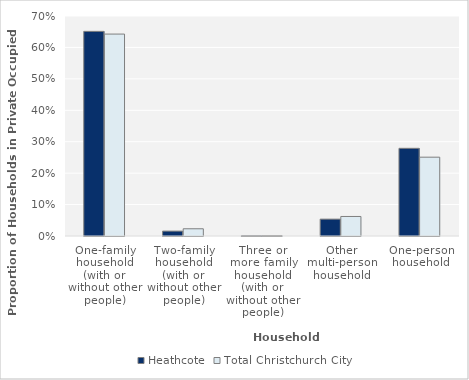
| Category | Heathcote | Total Christchurch City |
|---|---|---|
| One-family household (with or without other people) | 0.651 |  |
| Two-family household (with or without other people) | 0.016 |  |
| Three or more family household (with or without other people) | 0.001 |  |
| Other multi-person household | 0.054 |  |
| One-person household | 0.279 |  |